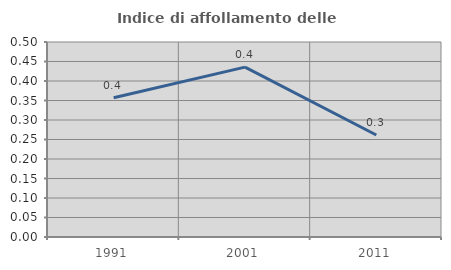
| Category | Indice di affollamento delle abitazioni  |
|---|---|
| 1991.0 | 0.357 |
| 2001.0 | 0.436 |
| 2011.0 | 0.262 |